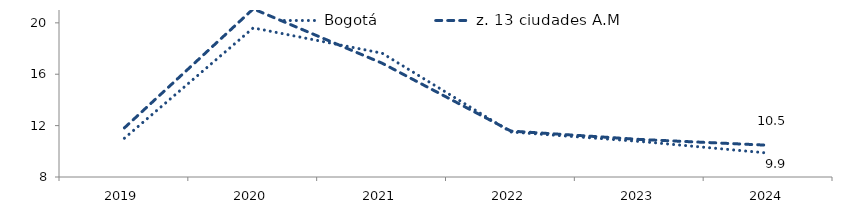
| Category | Bogotá | z. 13 ciudades A.M |
|---|---|---|
| 2019.0 | 11.019 | 11.824 |
| 2020.0 | 19.607 | 21.088 |
| 2021.0 | 17.638 | 16.861 |
| 2022.0 | 11.504 | 11.576 |
| 2023.0 | 10.77 | 10.924 |
| 2024.0 | 9.86 | 10.47 |